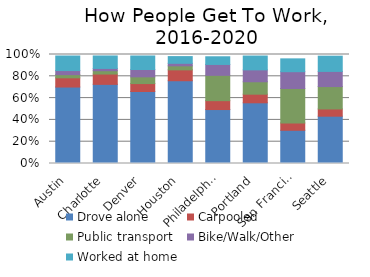
| Category | Drove alone | Carpooled | Public transport | Bike/Walk/Other | Worked at home |
|---|---|---|---|---|---|
| Austin | 0.701 | 0.085 | 0.029 | 0.038 | 0.134 |
| Charlotte | 0.726 | 0.095 | 0.03 | 0.021 | 0.114 |
| Denver | 0.661 | 0.073 | 0.062 | 0.068 | 0.124 |
| Houston | 0.759 | 0.1 | 0.037 | 0.023 | 0.062 |
| Philadelphia | 0.495 | 0.082 | 0.232 | 0.1 | 0.07 |
| Portland | 0.557 | 0.079 | 0.114 | 0.109 | 0.127 |
| San Francisco | 0.305 | 0.068 | 0.316 | 0.154 | 0.118 |
| Seattle | 0.434 | 0.066 | 0.205 | 0.139 | 0.14 |